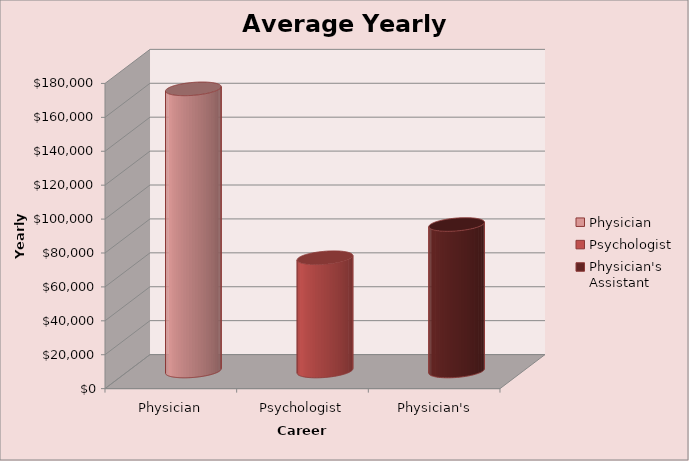
| Category | Average Income |
|---|---|
| Physician | 166400 |
| Psychologist | 66800 |
| Physician's Assistant | 86400 |